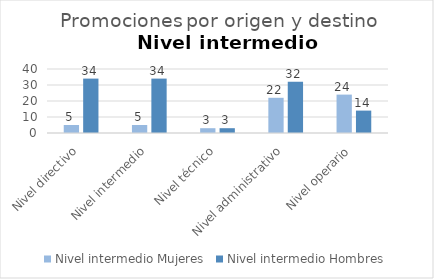
| Category | Nivel intermedio |
|---|---|
| Nivel directivo | 34 |
| Nivel intermedio | 34 |
| Nivel técnico | 3 |
| Nivel administrativo | 32 |
| Nivel operario | 14 |